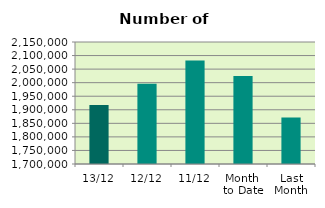
| Category | Series 0 |
|---|---|
| 13/12 | 1917830 |
| 12/12 | 1995756 |
| 11/12 | 2082126 |
| Month 
to Date | 2024398.667 |
| Last
Month | 1871523.909 |